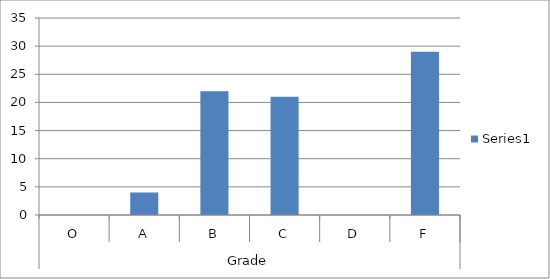
| Category | Series 0 |
|---|---|
| 0 | 0 |
| 1 | 4 |
| 2 | 22 |
| 3 | 21 |
| 4 | 0 |
| 5 | 29 |